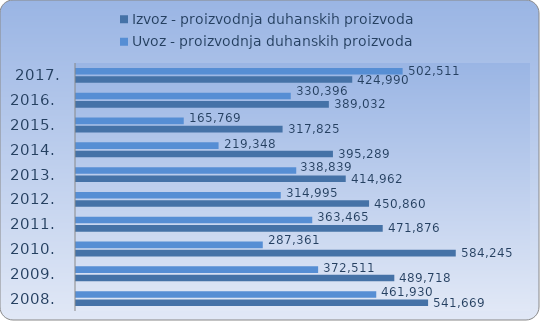
| Category | Izvoz - proizvodnja duhanskih proizvoda | Uvoz - proizvodnja duhanskih proizvoda |
|---|---|---|
| 2008.  | 541669.036 | 461930.043 |
| 2009.  | 489717.667 | 372510.85 |
| 2010.  | 584245.012 | 287360.864 |
| 2011.  | 471876.364 | 363465.04 |
| 2012.  | 450859.694 | 314994.868 |
| 2013.  | 414962.214 | 338838.737 |
| 2014.  | 395289.06 | 219347.944 |
| 2015.  | 317824.81 | 165768.822 |
| 2016.  | 389032.255 | 330395.695 |
| 2017. | 424989.619 | 502511.108 |